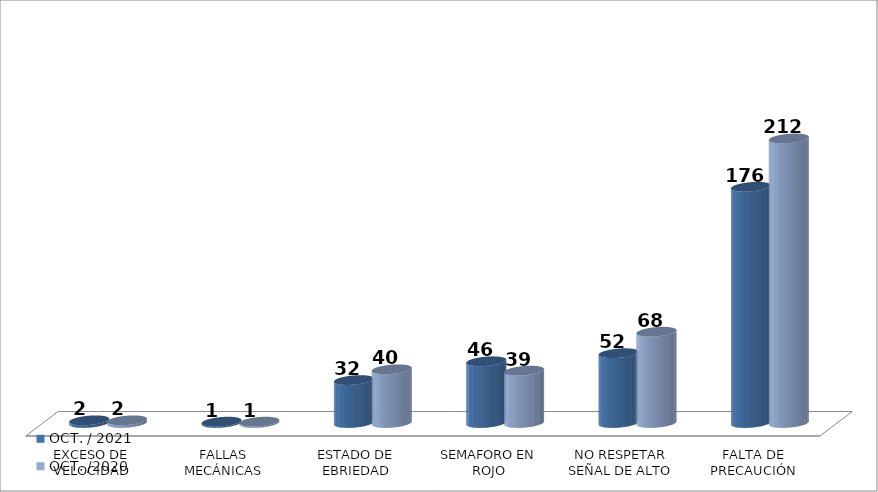
| Category | OCT. / 2021 | OCT. /2020 |
|---|---|---|
| EXCESO DE VELOCIDAD | 2 | 2 |
| FALLAS MECÁNICAS | 1 | 1 |
| ESTADO DE EBRIEDAD | 32 | 40 |
| SEMAFORO EN ROJO | 46 | 39 |
| NO RESPETAR SEÑAL DE ALTO | 52 | 68 |
| FALTA DE PRECAUCIÓN | 176 | 212 |